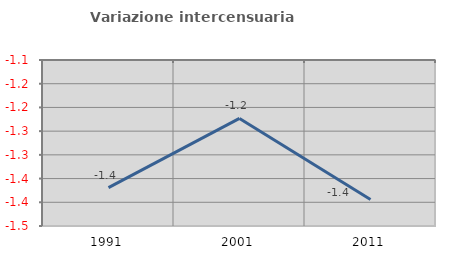
| Category | Variazione intercensuaria annua |
|---|---|
| 1991.0 | -1.369 |
| 2001.0 | -1.223 |
| 2011.0 | -1.394 |